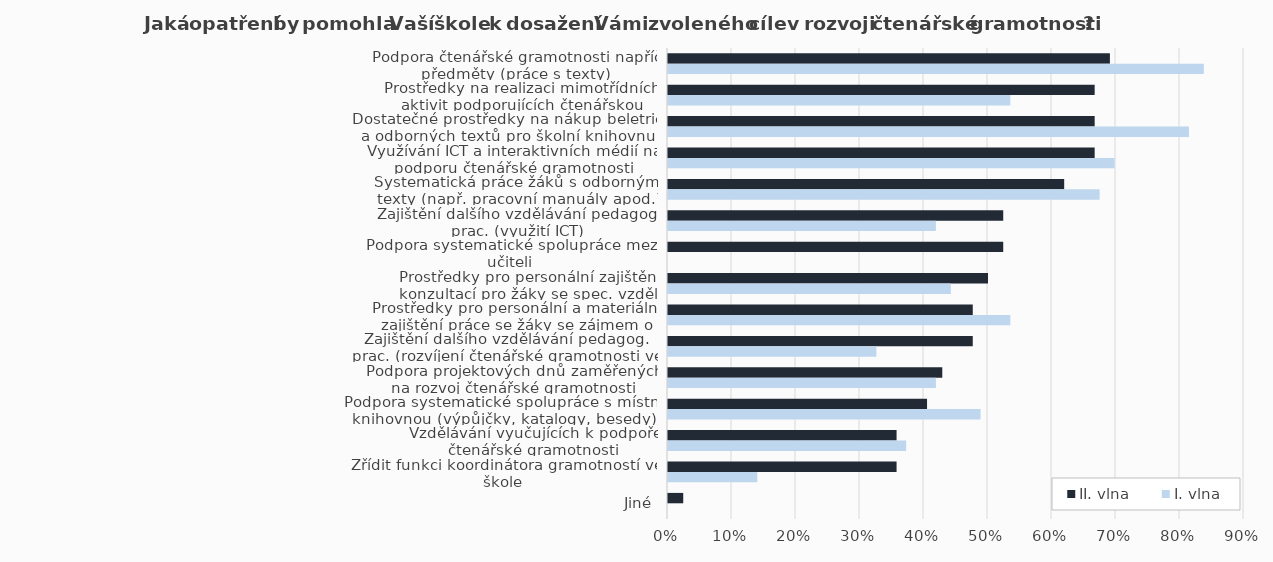
| Category | II. vlna | I. vlna |
|---|---|---|
| Podpora čtenářské gramotnosti napříč předměty (práce s texty) | 0.69 | 0.837 |
| Prostředky na realizaci mimotřídních aktivit podporujících čtenářskou gramotnost | 0.667 | 0.535 |
| Dostatečné prostředky na nákup beletrie a odborných textů pro školní knihovnu | 0.667 | 0.814 |
| Využívání ICT a interaktivních médií na podporu čtenářské gramotnosti | 0.667 | 0.698 |
| Systematická práce žáků s odbornými texty (např. pracovní manuály apod.) | 0.619 | 0.674 |
| Zajištění dalšího vzdělávání pedagog. prac. (využití ICT) | 0.524 | 0.419 |
| Podpora systematické spolupráce mezi učiteli | 0.524 | 0 |
| Prostředky pro personální zajištění konzultací pro žáky se spec. vzděl. potřebami | 0.5 | 0.442 |
| Prostředky pro personální a materiální zajištění práce se žáky se zájmem o literaturu | 0.476 | 0.535 |
| Zajištění dalšího vzdělávání pedagog. prac. (rozvíjení čtenářské gramotnosti ve výuce) | 0.476 | 0.326 |
| Podpora projektových dnů zaměřených na rozvoj čtenářské gramotnosti | 0.429 | 0.419 |
| Podpora systematické spolupráce s místní knihovnou (výpůjčky, katalogy, besedy) | 0.405 | 0.488 |
| Vzdělávání vyučujících k podpoře čtenářské gramotnosti | 0.357 | 0.372 |
| Zřídit funkci koordinátora gramotností ve škole | 0.357 | 0.14 |
| Jiné | 0.024 | 0 |